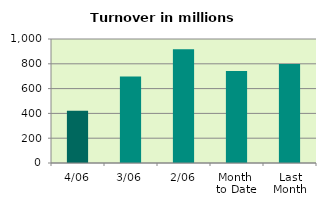
| Category | Series 0 |
|---|---|
| 4/06 | 422.013 |
| 3/06 | 698.41 |
| 2/06 | 917.659 |
| Month 
to Date | 741.134 |
| Last
Month | 798.504 |